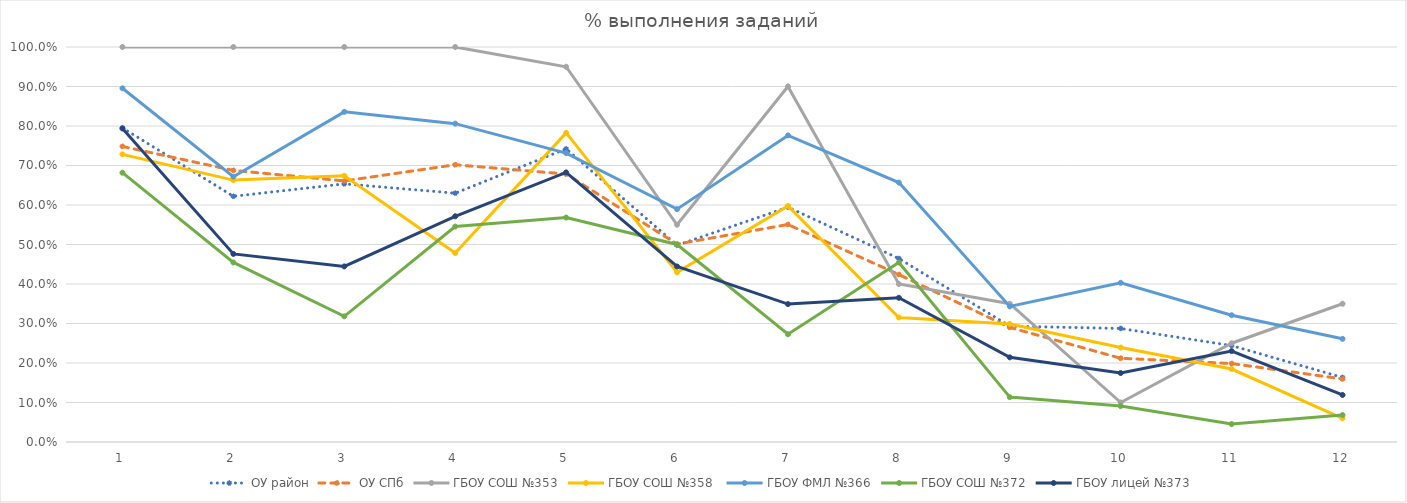
| Category | ОУ район | ОУ СПб | ГБОУ СОШ №353 | ГБОУ СОШ №358  | ГБОУ ФМЛ №366 | ГБОУ СОШ №372 | ГБОУ лицей №373 |
|---|---|---|---|---|---|---|---|
| 0 | 0.795 | 0.748 | 1 | 0.728 | 0.896 | 0.682 | 0.794 |
| 1 | 0.622 | 0.688 | 1 | 0.663 | 0.672 | 0.455 | 0.476 |
| 2 | 0.654 | 0.661 | 1 | 0.674 | 0.836 | 0.318 | 0.444 |
| 3 | 0.63 | 0.702 | 1 | 0.478 | 0.806 | 0.545 | 0.571 |
| 4 | 0.742 | 0.678 | 0.95 | 0.783 | 0.731 | 0.568 | 0.683 |
| 5 | 0.498 | 0.501 | 0.55 | 0.429 | 0.59 | 0.5 | 0.444 |
| 6 | 0.594 | 0.551 | 0.9 | 0.598 | 0.776 | 0.273 | 0.349 |
| 7 | 0.465 | 0.424 | 0.4 | 0.315 | 0.657 | 0.455 | 0.365 |
| 8 | 0.293 | 0.29 | 0.35 | 0.299 | 0.343 | 0.114 | 0.214 |
| 9 | 0.287 | 0.212 | 0.1 | 0.239 | 0.403 | 0.091 | 0.175 |
| 10 | 0.244 | 0.199 | 0.25 | 0.185 | 0.321 | 0.045 | 0.23 |
| 11 | 0.163 | 0.16 | 0.35 | 0.06 | 0.261 | 0.068 | 0.119 |